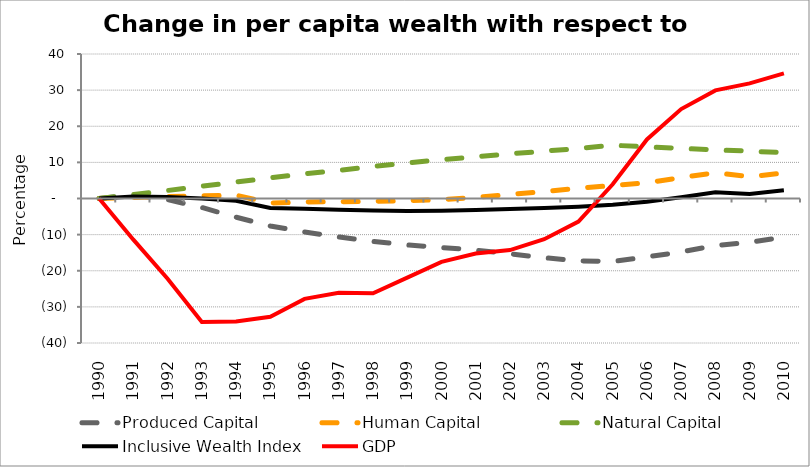
| Category | Produced Capital  | Human Capital | Natural Capital | Inclusive Wealth Index | GDP |
|---|---|---|---|---|---|
| 1990.0 | 0 | 0 | 0 | 0 | 0 |
| 1991.0 | 1.017 | 0.299 | 1.08 | 0.561 | -11.395 |
| 1992.0 | -0.316 | 0.556 | 2.218 | 0.417 | -22.189 |
| 1993.0 | -2.486 | 0.75 | 3.397 | -0.008 | -34.156 |
| 1994.0 | -5.166 | 0.905 | 4.576 | -0.607 | -34.034 |
| 1995.0 | -7.614 | -1.245 | 5.715 | -2.618 | -32.741 |
| 1996.0 | -9.262 | -0.995 | 6.807 | -2.861 | -27.789 |
| 1997.0 | -10.664 | -0.883 | 7.805 | -3.128 | -26.069 |
| 1998.0 | -11.873 | -0.797 | 8.855 | -3.352 | -26.217 |
| 1999.0 | -12.868 | -0.615 | 9.834 | -3.458 | -21.91 |
| 2000.0 | -13.553 | -0.298 | 10.752 | -3.391 | -17.558 |
| 2001.0 | -14.303 | 0.332 | 11.541 | -3.151 | -15.209 |
| 2002.0 | -15.29 | 1.099 | 12.361 | -2.889 | -14.269 |
| 2003.0 | -16.401 | 1.957 | 13.096 | -2.612 | -11.277 |
| 2004.0 | -17.249 | 2.816 | 13.857 | -2.256 | -6.382 |
| 2005.0 | -17.458 | 3.598 | 14.754 | -1.754 | 3.927 |
| 2006.0 | -16.176 | 4.372 | 14.284 | -0.918 | 16.354 |
| 2007.0 | -14.784 | 5.775 | 13.875 | 0.358 | 24.764 |
| 2008.0 | -13.045 | 7.127 | 13.44 | 1.7 | 29.921 |
| 2009.0 | -12.144 | 6.036 | 13.1 | 1.239 | 31.854 |
| 2010.0 | -10.654 | 7.063 | 12.702 | 2.303 | 34.631 |